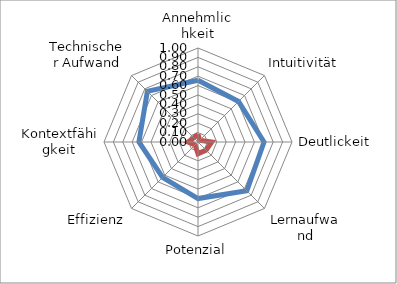
| Category | Series 0 | Series 1 |
|---|---|---|
| Annehmlichkeit | 0.657 | 0.082 |
| Intuitivität | 0.61 | 0.025 |
| Deutlickeit | 0.702 | 0.146 |
| Lernaufwand | 0.735 | 0.122 |
| Potenzial | 0.602 | 0.125 |
| Effizienz | 0.532 | 0.044 |
| Kontextfähigkeit | 0.629 | 0.105 |
| Technischer Aufwand | 0.762 | 0.063 |